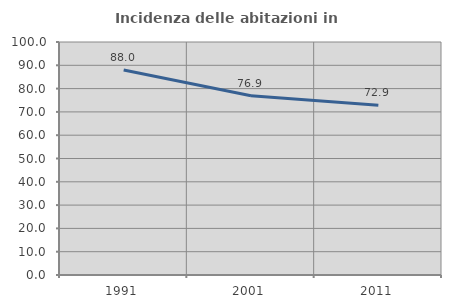
| Category | Incidenza delle abitazioni in proprietà  |
|---|---|
| 1991.0 | 88 |
| 2001.0 | 76.891 |
| 2011.0 | 72.889 |